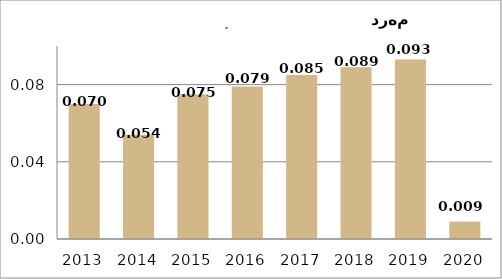
| Category | Series 0 |
|---|---|
| 2013.0 | 0.07 |
| 2014.0 | 0.054 |
| 2015.0 | 0.075 |
| 2016.0 | 0.079 |
| 2017.0 | 0.085 |
| 2018.0 | 0.089 |
| 2019.0 | 0.093 |
| 2020.0 | 0.009 |